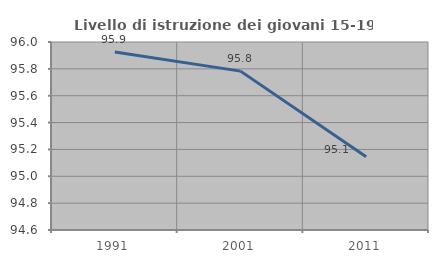
| Category | Livello di istruzione dei giovani 15-19 anni |
|---|---|
| 1991.0 | 95.926 |
| 2001.0 | 95.783 |
| 2011.0 | 95.146 |